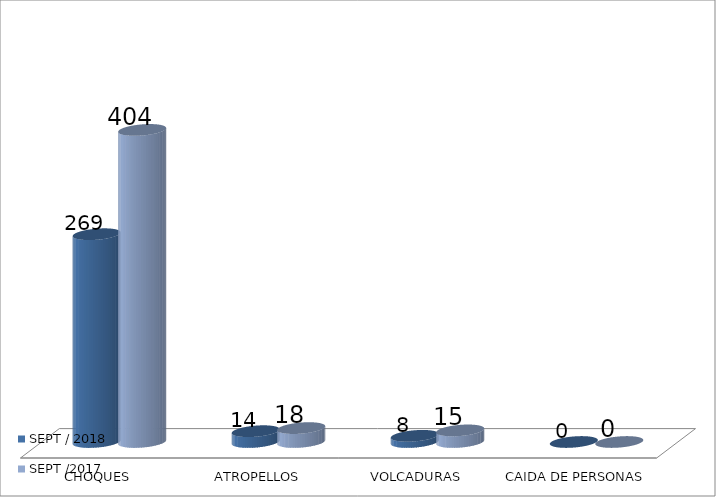
| Category | SEPT / 2018 | SEPT /2017 |
|---|---|---|
| CHOQUES | 269 | 404 |
| ATROPELLOS | 14 | 18 |
| VOLCADURAS | 8 | 15 |
| CAIDA DE PERSONAS | 0 | 0 |